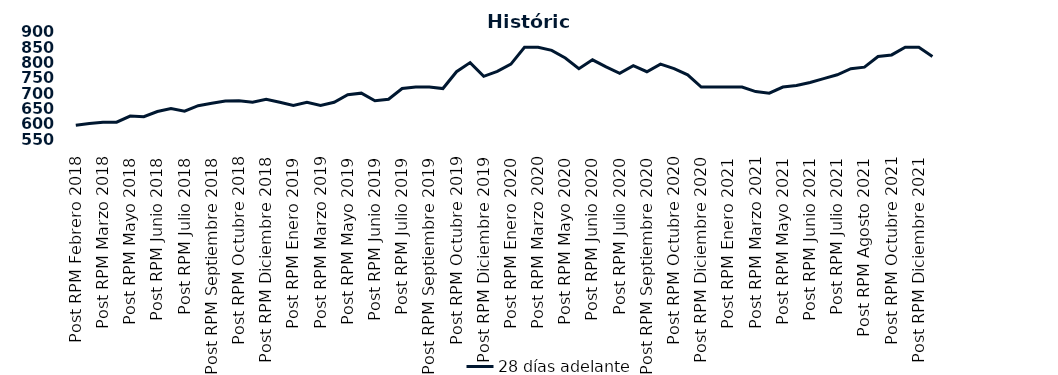
| Category | 28 días adelante |
|---|---|
| Post RPM Febrero 2018 | 595 |
| Pre RPM Marzo 2018 | 601 |
| Post RPM Marzo 2018 | 605 |
| Pre RPM Mayo 2018 | 605 |
| Post RPM Mayo 2018 | 625 |
| Pre RPM Junio 2018 | 623 |
| Post RPM Junio 2018 | 640 |
| Pre RPM Julio 2018 | 650 |
| Post RPM Julio 2018 | 641 |
| Pre RPM Septiembre 2018 | 659 |
| Post RPM Septiembre 2018 | 666.75 |
| Pre RPM Octubre 2018 | 674 |
| Post RPM Octubre 2018 | 675 |
| Pre RPM Diciembre 2018 | 670 |
| Post RPM Diciembre 2018 | 680 |
| Pre RPM Enero 2019 | 670 |
| Post RPM Enero 2019 | 660 |
| Pre RPM Marzo 2019 | 670 |
| Post RPM Marzo 2019 | 660 |
| Pre RPM Mayo 2019 | 670 |
| Post RPM Mayo 2019 | 695 |
| Pre RPM Junio 2019 | 700 |
| Post RPM Junio 2019 | 675 |
| Pre RPM Julio 2019 | 680 |
| Post RPM Julio 2019 | 715 |
| Pre RPM Septiembre 2019 | 720 |
| Post RPM Septiembre 2019 | 720 |
| Pre RPM Octubre 2019 | 715 |
| Post RPM Octubre 2019 | 770 |
| Pre RPM Diciembre 2019 | 800 |
| Post RPM Diciembre 2019 | 755 |
| Pre RPM Enero 2020 | 771 |
| Post RPM Enero 2020 | 795 |
| Pre RPM Marzo 2020 | 850 |
| Post RPM Marzo 2020 | 850 |
| Pre RPM Mayo 2020 | 840 |
| Post RPM Mayo 2020 | 815 |
| Pre RPM Junio 2020 | 780 |
| Post RPM Junio 2020 | 809 |
| Pre RPM Julio 2020 | 785.72 |
| Post RPM Julio 2020 | 765 |
| Pre RPM Septiembre 2020 | 790 |
| Post RPM Septiembre 2020 | 770 |
| Pre RPM Octubre 2020 | 795 |
| Post RPM Octubre 2020 | 780 |
| Pre RPM Diciembre 2020 | 760 |
| Post RPM Diciembre 2020 | 720 |
| Pre RPM Enero 2021 | 720 |
| Post RPM Enero 2021 | 720 |
| Pre RPM Marzo 2021 | 720 |
| Post RPM Marzo 2021 | 705 |
| Pre RPM Mayo 2021 | 700 |
| Post RPM Mayo 2021 | 720 |
| Pre RPM Junio 2021 | 725 |
| Post RPM Junio 2021 | 735 |
| Pre RPM Julio 2021 | 747.5 |
| Post RPM Julio 2021 | 760 |
| Pre RPM Agosto 2021 | 780 |
| Post RPM Agosto 2021 | 785 |
| Pre RPM Octubre 2021 | 820 |
| Post RPM Octubre 2021 | 825 |
| Pre RPM Diciembre 2021 | 850 |
| Post RPM Diciembre 2021 | 850 |
| Pre RPM Enero 2022 | 820 |